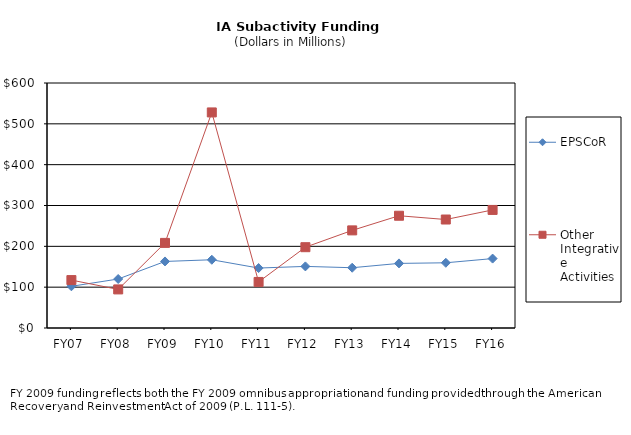
| Category | EPSCoR | Other Integrative Activities |
|---|---|---|
| FY07 | 102.11 | 117.34 |
| FY08 | 120 | 94.48 |
| FY09 | 163 | 208.43 |
| FY10 | 167.11 | 527.93 |
| FY11 | 146.82 | 112.78 |
| FY12 | 150.85 | 197.88 |
| FY13 | 147.6 | 239.054 |
| FY14 | 158.19 | 274.93 |
| FY15 | 159.69 | 265.65 |
| FY16 | 169.99 | 289.16 |